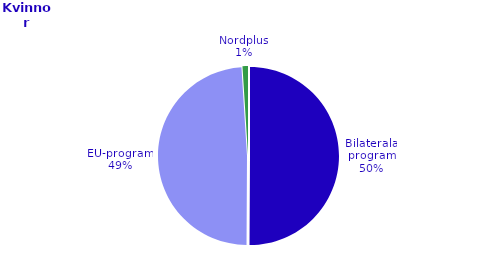
| Category | Series 0 |
|---|---|
| Bilaterala program | 2069 |
| EU-program | 2021 |
| Nordplus | 41 |